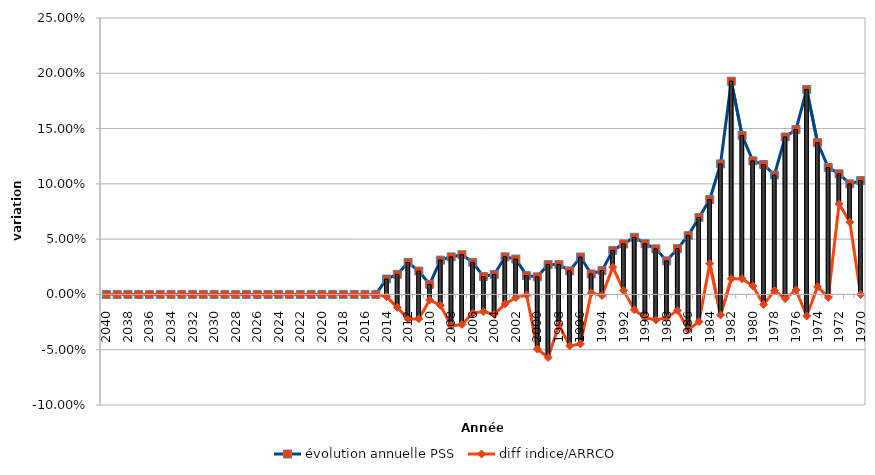
| Category | évolution annuelle PSS | diff indice/ARRCO |
|---|---|---|
| 2040 | 0 | 0 |
| 2039 | 0 | 0 |
| 2038 | 0 | 0 |
| 2037 | 0 | 0 |
| 2036 | 0 | 0 |
| 2035 | 0 | 0 |
| 2034 | 0 | 0 |
| 2033 | 0 | 0 |
| 2032 | 0 | 0 |
| 2031 | 0 | 0 |
| 2030 | 0 | 0 |
| 2029 | 0 | 0 |
| 2028 | 0 | 0 |
| 2027 | 0 | 0 |
| 2026 | 0 | 0 |
| 2025 | 0 | 0 |
| 2024 | 0 | 0 |
| 2023 | 0 | 0 |
| 2022 | 0 | 0 |
| 2021 | 0 | 0 |
| 2020 | 0 | 0 |
| 2019 | 0 | 0 |
| 2018 | 0 | 0 |
| 2017 | 0 | 0 |
| 2016 | 0 | 0 |
| 2015 | 0 | 0 |
| 2014 | 0.014 | -0.002 |
| 2013 | 0.018 | -0.012 |
| 2012 | 0.029 | -0.022 |
| 2011 | 0.021 | -0.022 |
| 2010 | 0.009 | -0.005 |
| 2009 | 0.031 | -0.01 |
| 2008 | 0.034 | -0.028 |
| 2007 | 0.036 | -0.027 |
| 2006 | 0.029 | -0.017 |
| 2005 | 0.016 | -0.016 |
| 2004 | 0.018 | -0.018 |
| 2003 | 0.034 | -0.009 |
| 2002 | 0.032 | -0.003 |
| 2001 | 0.017 | 0 |
| 2000 | 0.016 | -0.049 |
| 1999 | 0.027 | -0.057 |
| 1998 | 0.027 | -0.028 |
| 1997 | 0.021 | -0.047 |
| 1996 | 0.034 | -0.045 |
| 1995 | 0.019 | 0.001 |
| 1994 | 0.022 | -0.001 |
| 1993 | 0.04 | 0.025 |
| 1992 | 0.046 | 0.004 |
| 1991 | 0.052 | -0.014 |
| 1990 | 0.046 | -0.021 |
| 1989 | 0.041 | -0.023 |
| 1988 | 0.03 | -0.021 |
| 1987 | 0.041 | -0.014 |
| 1986 | 0.053 | -0.032 |
| 1985 | 0.07 | -0.025 |
| 1984 | 0.086 | 0.028 |
| 1983 | 0.118 | -0.019 |
| 1982 | 0.193 | 0.014 |
| 1981 | 0.144 | 0.014 |
| 1980 | 0.121 | 0.008 |
| 1979 | 0.117 | -0.009 |
| 1978 | 0.108 | 0.003 |
| 1977 | 0.142 | -0.004 |
| 1976 | 0.149 | 0.004 |
| 1975 | 0.185 | -0.02 |
| 1974 | 0.137 | 0.007 |
| 1973 | 0.115 | -0.003 |
| 1972 | 0.109 | 0.082 |
| 1971 | 0.1 | 0.065 |
| 1970 | 0.103 | 0 |